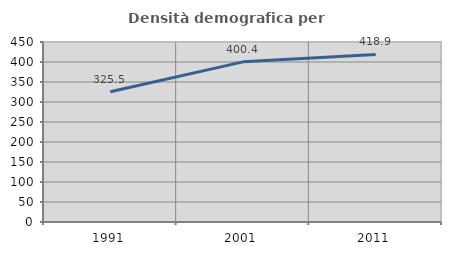
| Category | Densità demografica |
|---|---|
| 1991.0 | 325.512 |
| 2001.0 | 400.371 |
| 2011.0 | 418.95 |